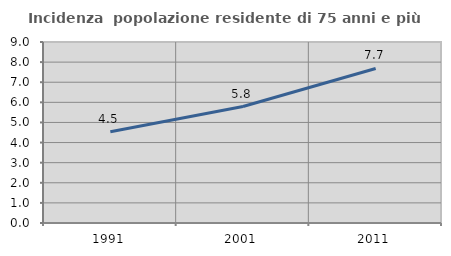
| Category | Incidenza  popolazione residente di 75 anni e più |
|---|---|
| 1991.0 | 4.539 |
| 2001.0 | 5.791 |
| 2011.0 | 7.684 |